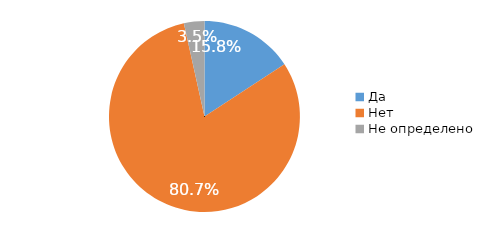
| Category | Series 0 |
|---|---|
| Да | 0.158 |
| Нет | 0.807 |
| Не определено | 0.035 |